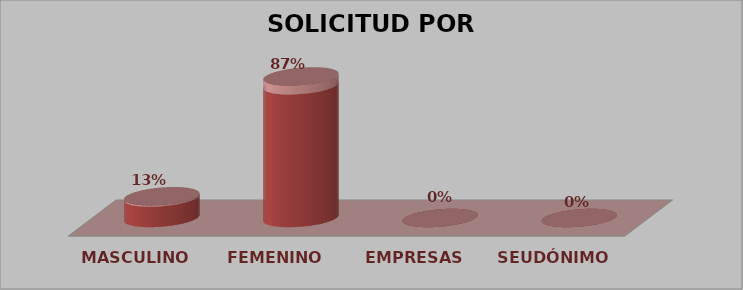
| Category | SOLICITUD POR GÉNERO | Series 1 |
|---|---|---|
| MASCULINO | 2 | 0.133 |
| FEMENINO | 13 | 0.867 |
| EMPRESAS | 0 | 0 |
| SEUDÓNIMO | 0 | 0 |